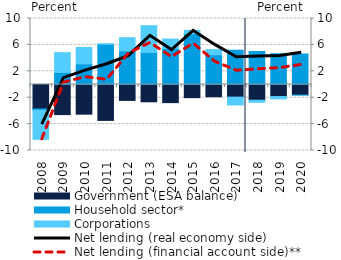
| Category | Government (ESA balance) | Household sector* | Corporations |
|---|---|---|---|
| 2008.0 | -3.698 | -0.202 | -4.404 |
| 2009.0 | -4.561 | 1.816 | 3.012 |
| 2010.0 | -4.497 | 3.122 | 2.493 |
| 2011.0 | -5.441 | 6.096 | 0.059 |
| 2012.0 | -2.409 | 5.095 | 2.005 |
| 2013.0 | -2.621 | 4.863 | 4.054 |
| 2014.0 | -2.747 | 5.462 | 1.426 |
| 2015.0 | -1.994 | 7.706 | 0.495 |
| 2016.0 | -1.854 | 4.503 | 0.791 |
| 2017.0 | -1.913 | 5.193 | -1.191 |
| 2018.0 | -2.38 | 5.002 | -0.316 |
| 2019.0 | -1.825 | 4.664 | -0.353 |
| 2020.0 | -1.625 | 4.624 | -0.03 |